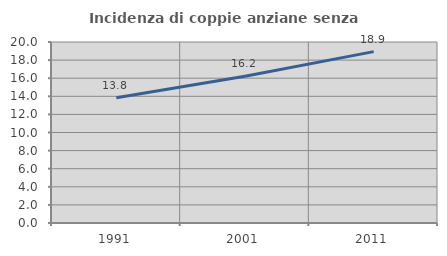
| Category | Incidenza di coppie anziane senza figli  |
|---|---|
| 1991.0 | 13.849 |
| 2001.0 | 16.211 |
| 2011.0 | 18.936 |